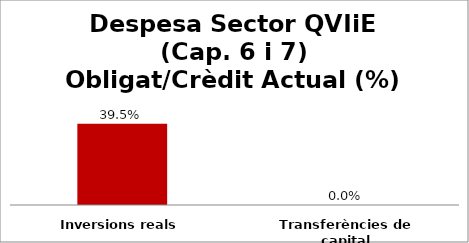
| Category | Series 0 |
|---|---|
| Inversions reals | 0.395 |
| Transferències de capital | 0 |